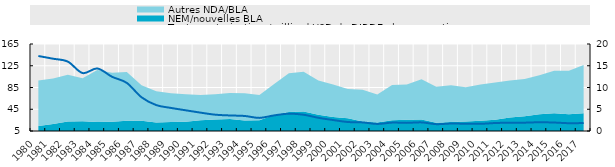
| Category | Toutes autorisations/milliard USD de DIRDE pharmaceutiques |
|---|---|
| 1980.0 | 17.238 |
| 1981.0 | 16.616 |
| 1982.0 | 15.951 |
| 1983.0 | 13.321 |
| 1984.0 | 14.37 |
| 1985.0 | 12.466 |
| 1986.0 | 11.057 |
| 1987.0 | 7.754 |
| 1988.0 | 5.953 |
| 1989.0 | 5.304 |
| 1990.0 | 4.757 |
| 1991.0 | 4.223 |
| 1992.0 | 3.751 |
| 1993.0 | 3.572 |
| 1994.0 | 3.456 |
| 1995.0 | 3.016 |
| 1996.0 | 3.588 |
| 1997.0 | 3.977 |
| 1998.0 | 3.739 |
| 1999.0 | 3.035 |
| 2000.0 | 2.521 |
| 2001.0 | 2.066 |
| 2002.0 | 1.974 |
| 2003.0 | 1.622 |
| 2004.0 | 1.93 |
| 2005.0 | 1.867 |
| 2006.0 | 1.979 |
| 2007.0 | 1.577 |
| 2008.0 | 1.713 |
| 2009.0 | 1.67 |
| 2010.0 | 1.645 |
| 2011.0 | 1.834 |
| 2012.0 | 1.908 |
| 2013.0 | 1.917 |
| 2014.0 | 2.013 |
| 2015.0 | 1.945 |
| 2016.0 | 1.792 |
| 2017.0 | 1.83 |